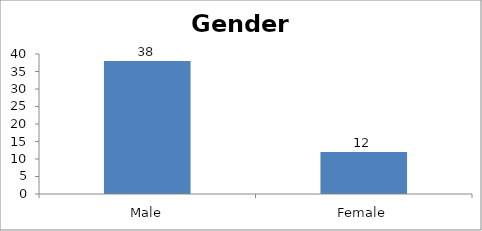
| Category | Gender |
|---|---|
| Male | 38 |
| Female | 12 |